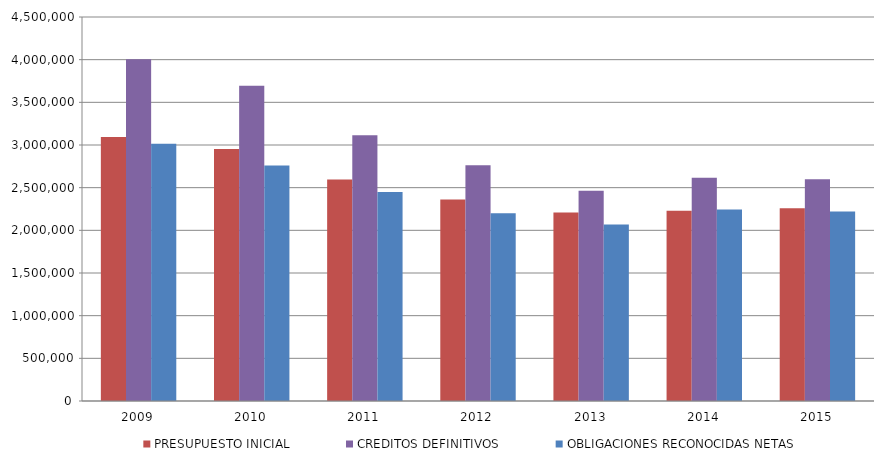
| Category | PRESUPUESTO INICIAL | CREDITOS DEFINITIVOS | OBLIGACIONES RECONOCIDAS NETAS |
|---|---|---|---|
| 2009.0 | 3093843.317 | 4003672.99 | 3013196.1 |
| 2010.0 | 2954216.153 | 3695312.622 | 2760471.816 |
| 2011.0 | 2594698.339 | 3115266.712 | 2449416.224 |
| 2012.0 | 2362389.293 | 2763980.265 | 2200272.47 |
| 2013.0 | 2209300.484 | 2462534.405 | 2067080.929 |
| 2014.0 | 2230001.37 | 2616999.566 | 2243846.616 |
| 2015.0 | 2260019.423 | 2598369.563 | 2220814.271 |